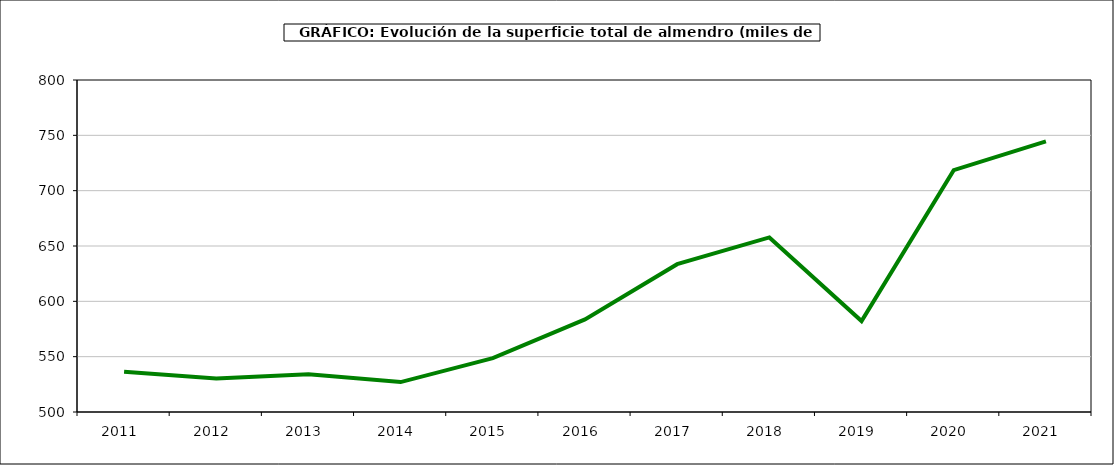
| Category | superficie almendro |
|---|---|
| 2011.0 | 536.312 |
| 2012.0 | 530.223 |
| 2013.0 | 534.057 |
| 2014.0 | 527.029 |
| 2015.0 | 548.604 |
| 2016.0 | 583.673 |
| 2017.0 | 633.562 |
| 2018.0 | 657.768 |
| 2019.0 | 582.174 |
| 2020.0 | 718.54 |
| 2021.0 | 744.466 |